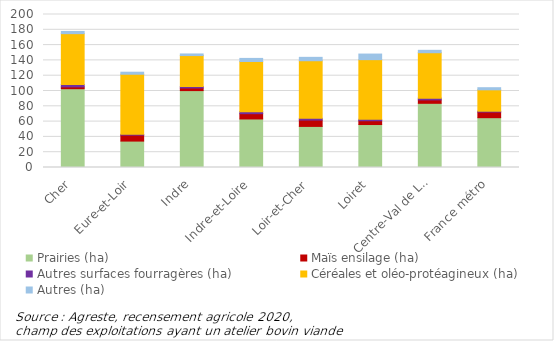
| Category | Prairies (ha) | Maïs ensilage (ha) | Autres surfaces fourragères (ha) | Céréales et oléo-protéagineux (ha) | Autres (ha) |
|---|---|---|---|---|---|
| Cher | 103.012 | 2.329 | 3.149 | 66.46 | 2.894 |
| Eure-et-Loir | 34.524 | 7.814 | 0.967 | 78.609 | 2.648 |
| Indre | 100.526 | 3.427 | 1.942 | 40.42 | 2.12 |
| Indre-et-Loire | 63.449 | 6.906 | 2.657 | 65.549 | 4.042 |
| Loir-et-Cher | 53.71 | 8.287 | 2.241 | 75.323 | 4.431 |
| Loiret | 56.159 | 4.959 | 1.896 | 77.953 | 7.322 |
| Centre-Val de Loire | 83.913 | 4.469 | 2.3 | 59.332 | 3.163 |
| France métro | 65.105 | 7.411 | 1.055 | 27.959 | 2.779 |